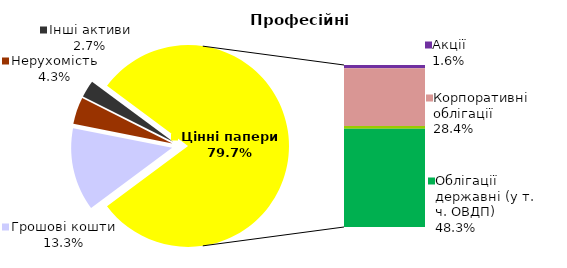
| Category | Професійні |
|---|---|
| Грошові кошти | 21.505 |
| Банківські метали | 0 |
| Нерухомість | 7.006 |
| Інші активи | 4.442 |
| Акції | 2.574 |
| Корпоративні облігації | 46.065 |
| Облігації місцевих рад | 2.215 |
| Облігації державні (у т. ч. ОВДП) | 78.396 |